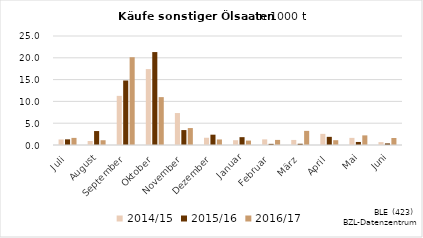
| Category | 2014/15 | 2015/16 | 2016/17 |
|---|---|---|---|
| Juli | 1.269 | 1.296 | 1.631 |
| August | 0.921 | 3.2 | 1.093 |
| September | 11.269 | 14.792 | 20.134 |
| Oktober | 17.41 | 21.314 | 10.981 |
| November | 7.33 | 3.424 | 3.887 |
| Dezember | 1.663 | 2.366 | 1.272 |
| Januar | 1.099 | 1.798 | 1.016 |
| Februar | 1.29 | 0.26 | 1.165 |
| März | 1.16 | 0.286 | 3.239 |
| April | 2.555 | 1.869 | 1.102 |
| Mai | 1.632 | 0.696 | 2.207 |
| Juni | 0.666 | 0.364 | 1.607 |